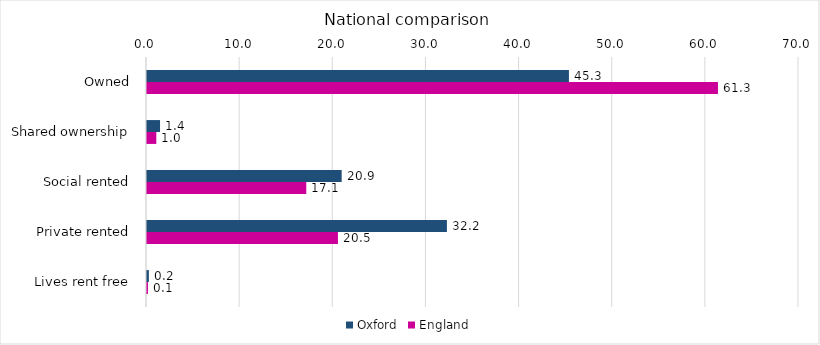
| Category | Oxford | England |
|---|---|---|
| Owned | 45.3 | 61.3 |
| Shared ownership | 1.4 | 1 |
| Social rented | 20.9 | 17.1 |
| Private rented | 32.2 | 20.5 |
| Lives rent free | 0.2 | 0.1 |